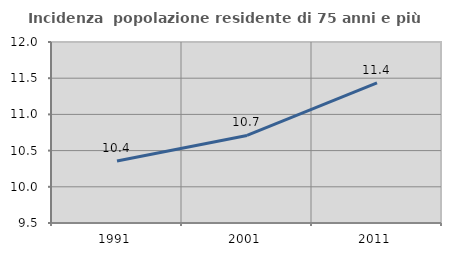
| Category | Incidenza  popolazione residente di 75 anni e più |
|---|---|
| 1991.0 | 10.356 |
| 2001.0 | 10.709 |
| 2011.0 | 11.436 |